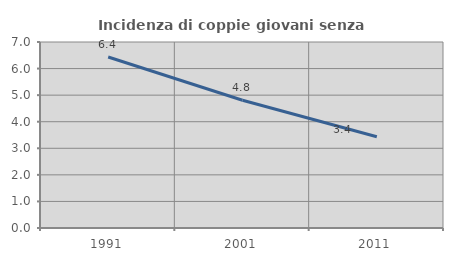
| Category | Incidenza di coppie giovani senza figli |
|---|---|
| 1991.0 | 6.436 |
| 2001.0 | 4.809 |
| 2011.0 | 3.433 |